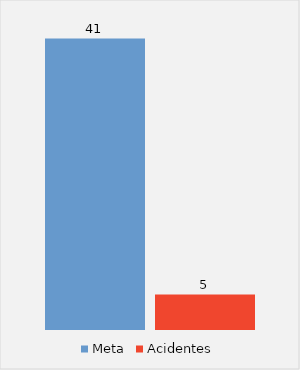
| Category | Meta | Acidentes |
|---|---|---|
|  | 41 | 5 |